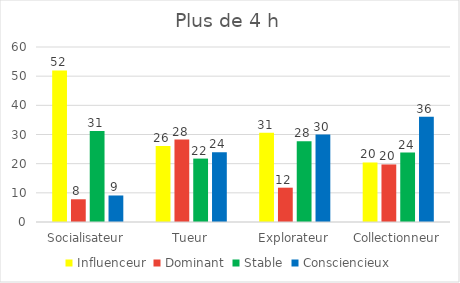
| Category | Influenceur | Dominant | Stable | Consciencieux |
|---|---|---|---|---|
| Socialisateur | 51.948 | 7.792 | 31.169 | 9.091 |
| Tueur | 26.087 | 28.261 | 21.739 | 23.913 |
| Explorateur | 30.588 | 11.765 | 27.647 | 30 |
| Collectionneur | 20.408 | 19.728 | 23.81 | 36.054 |